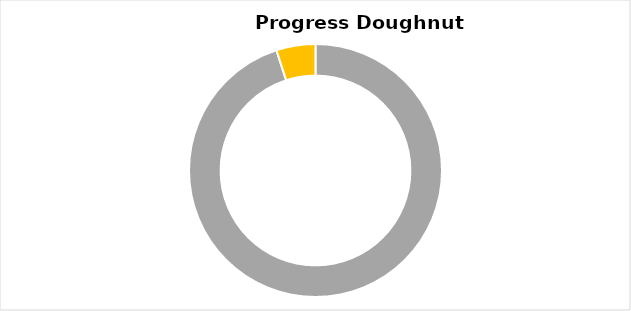
| Category | Complete |
|---|---|
| 0 | 0 |
| 1 | 0 |
| 2 | 0.95 |
| 3 | 0.05 |